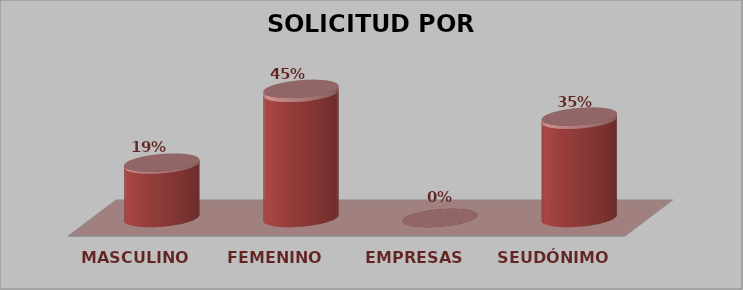
| Category | SOLICITUD POR GÉNERO | Series 1 |
|---|---|---|
| MASCULINO | 6 | 0.194 |
| FEMENINO | 14 | 0.452 |
| EMPRESAS | 0 | 0 |
| SEUDÓNIMO | 11 | 0.355 |